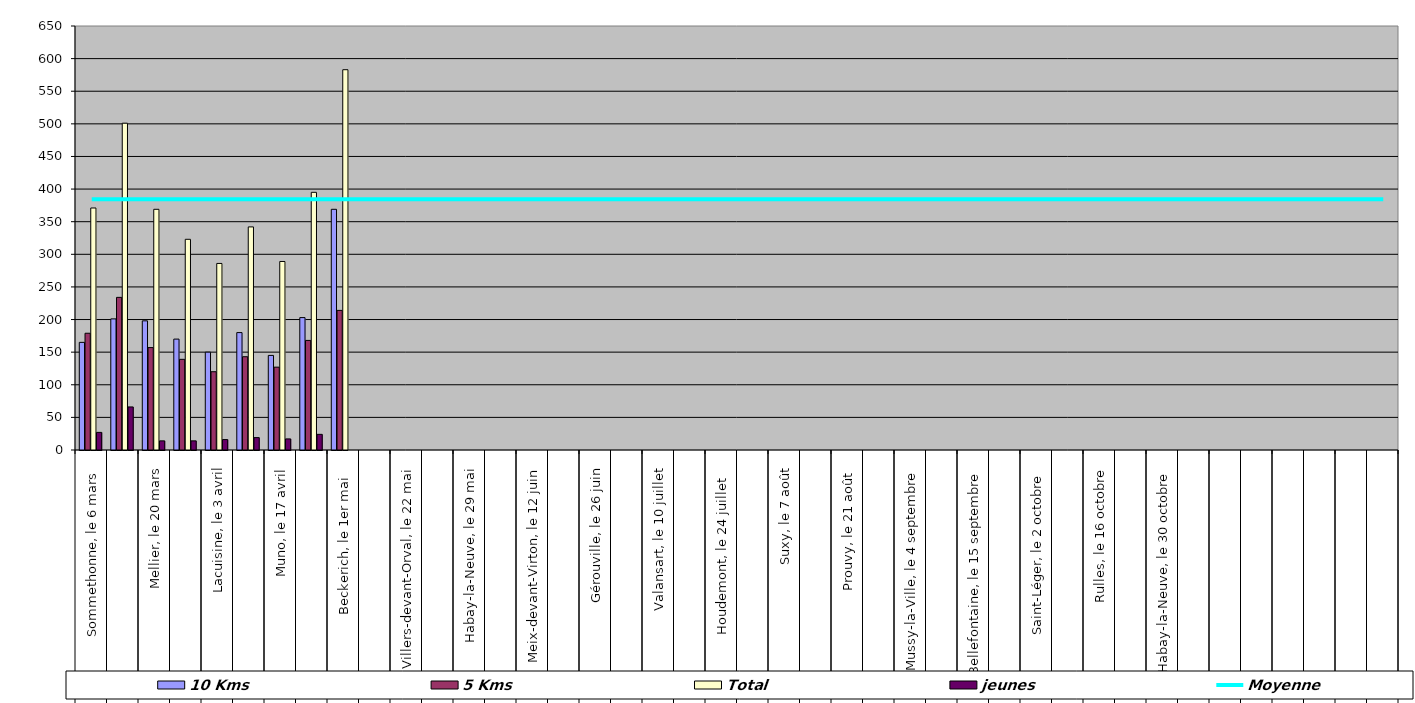
| Category | 10 Kms | 5 Kms | Total | jeunes |
|---|---|---|---|---|
| 0 | 165 | 179 | 371 | 27 |
| 1 | 201 | 234 | 501 | 66 |
| 2 | 198 | 157 | 369 | 14 |
| 3 | 170 | 139 | 323 | 14 |
| 4 | 150 | 120 | 286 | 16 |
| 5 | 180 | 143 | 342 | 19 |
| 6 | 145 | 127 | 289 | 17 |
| 7 | 203 | 168 | 395 | 24 |
| 8 | 369 | 214 | 583 | 0 |
| 9 | 0 | 0 | 0 | 0 |
| 10 | 0 | 0 | 0 | 0 |
| 11 | 0 | 0 | 0 | 0 |
| 12 | 0 | 0 | 0 | 0 |
| 13 | 0 | 0 | 0 | 0 |
| 14 | 0 | 0 | 0 | 0 |
| 15 | 0 | 0 | 0 | 0 |
| 16 | 0 | 0 | 0 | 0 |
| 17 | 0 | 0 | 0 | 0 |
| 18 | 0 | 0 | 0 | 0 |
| 19 | 0 | 0 | 0 | 0 |
| 20 | 0 | 0 | 0 | 0 |
| 21 | 0 | 0 | 0 | 0 |
| 22 | 0 | 0 | 0 | 0 |
| 23 | 0 | 0 | 0 | 0 |
| 24 | 0 | 0 | 0 | 0 |
| 25 | 0 | 0 | 0 | 0 |
| 26 | 0 | 0 | 0 | 0 |
| 27 | 0 | 0 | 0 | 0 |
| 28 | 0 | 0 | 0 | 0 |
| 29 | 0 | 0 | 0 | 0 |
| 30 | 0 | 0 | 0 | 0 |
| 31 | 0 | 0 | 0 | 0 |
| 32 | 0 | 0 | 0 | 0 |
| 33 | 0 | 0 | 0 | 0 |
| 34 | 0 | 0 | 0 | 0 |
| 35 | 0 | 0 | 0 | 0 |
| 36 | 0 | 0 | 0 | 0 |
| 37 | 0 | 0 | 0 | 0 |
| 38 | 0 | 0 | 0 | 0 |
| 39 | 0 | 0 | 0 | 0 |
| 40 | 0 | 0 | 0 | 0 |
| 41 | 0 | 0 | 0 | 0 |